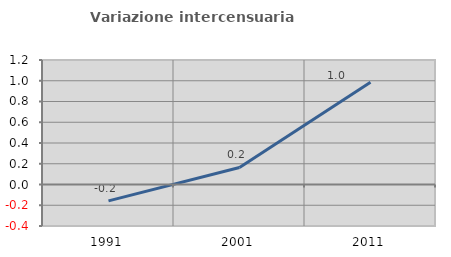
| Category | Variazione intercensuaria annua |
|---|---|
| 1991.0 | -0.158 |
| 2001.0 | 0.164 |
| 2011.0 | 0.986 |